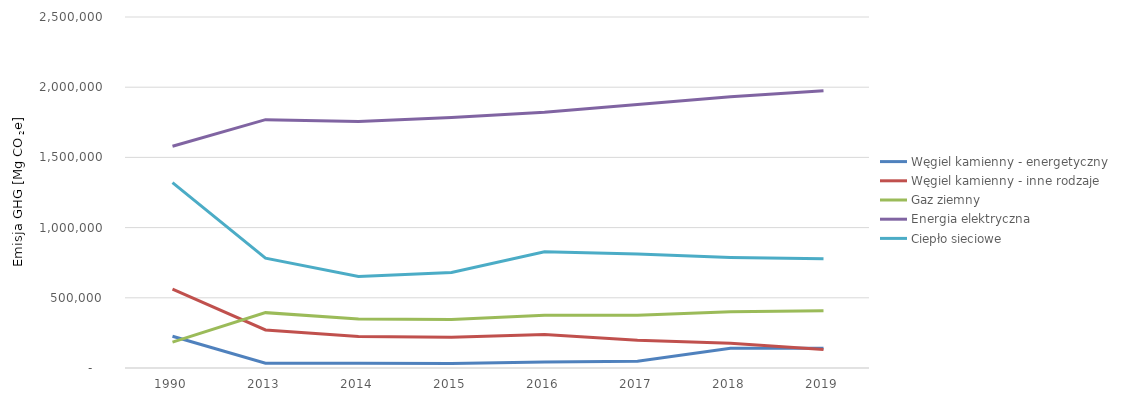
| Category | Węgiel kamienny - energetyczny | Węgiel kamienny - inne rodzaje | Gaz ziemny | Energia elektryczna | Ciepło sieciowe |
|---|---|---|---|---|---|
| 1990.0 | 226256 | 561871 | 183951 | 1579399 | 1320000 |
| 2013.0 | 33579 | 270881 | 394350 | 1768917 | 782491 |
| 2014.0 | 33261 | 224563 | 348252 | 1756244 | 652343 |
| 2015.0 | 32153 | 219519 | 346184 | 1783381 | 680954 |
| 2016.0 | 41933 | 237923 | 376401 | 1822410 | 827440 |
| 2017.0 | 48895 | 197087 | 376381 | 1877084 | 811839 |
| 2018.0 | 140308 | 176105 | 400169 | 1931638 | 787850 |
| 2019.0 | 140308 | 132022 | 408138 | 1974145 | 777785 |